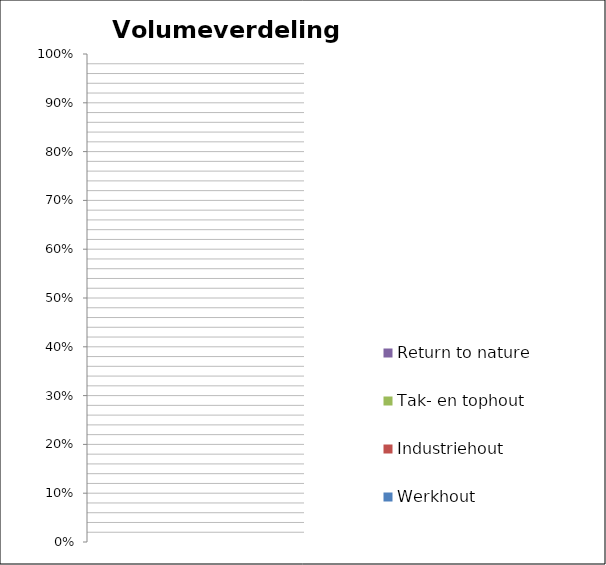
| Category | Werkhout | Industriehout | Tak- en tophout | Return to nature |
|---|---|---|---|---|
| 0 | 0 | 0 | 0 | 0 |